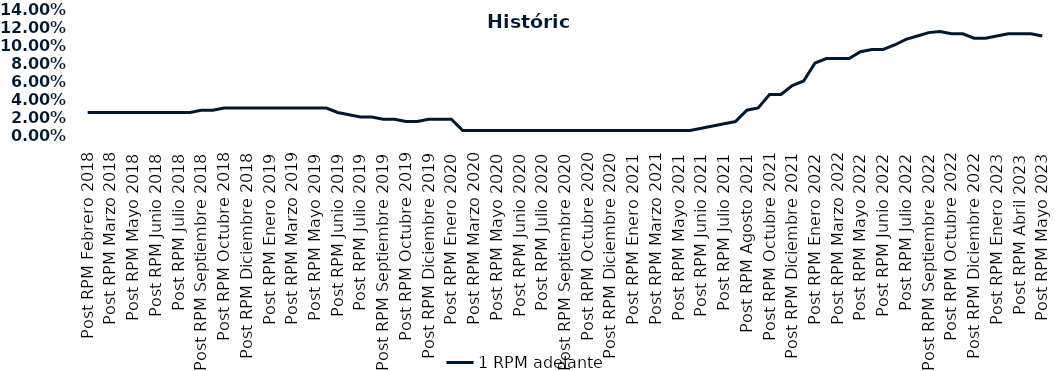
| Category | 1 RPM adelante |
|---|---|
| Post RPM Febrero 2018 | 0.025 |
| Pre RPM Marzo 2018 | 0.025 |
| Post RPM Marzo 2018 | 0.025 |
| Pre RPM Mayo 2018 | 0.025 |
| Post RPM Mayo 2018 | 0.025 |
| Pre RPM Junio 2018 | 0.025 |
| Post RPM Junio 2018 | 0.025 |
| Pre RPM Julio 2018 | 0.025 |
| Post RPM Julio 2018 | 0.025 |
| Pre RPM Septiembre 2018 | 0.025 |
| Post RPM Septiembre 2018 | 0.028 |
| Pre RPM Octubre 2018 | 0.028 |
| Post RPM Octubre 2018 | 0.03 |
| Pre RPM Diciembre 2018 | 0.03 |
| Post RPM Diciembre 2018 | 0.03 |
| Pre RPM Enero 2019 | 0.03 |
| Post RPM Enero 2019 | 0.03 |
| Pre RPM Marzo 2019 | 0.03 |
| Post RPM Marzo 2019 | 0.03 |
| Pre RPM Mayo 2019 | 0.03 |
| Post RPM Mayo 2019 | 0.03 |
| Pre RPM Junio 2019 | 0.03 |
| Post RPM Junio 2019 | 0.025 |
| Pre RPM Julio 2019 | 0.022 |
| Post RPM Julio 2019 | 0.02 |
| Pre RPM Septiembre 2019 | 0.02 |
| Post RPM Septiembre 2019 | 0.018 |
| Pre RPM Octubre 2019 | 0.018 |
| Post RPM Octubre 2019 | 0.015 |
| Pre RPM Diciembre 2019 | 0.015 |
| Post RPM Diciembre 2019 | 0.018 |
| Pre RPM Enero 2020 | 0.018 |
| Post RPM Enero 2020 | 0.018 |
| Pre RPM Marzo 2020 | 0.005 |
| Post RPM Marzo 2020 | 0.005 |
| Pre RPM Mayo 2020 | 0.005 |
| Post RPM Mayo 2020 | 0.005 |
| Pre RPM Junio 2020 | 0.005 |
| Post RPM Junio 2020 | 0.005 |
| Pre RPM Julio 2020 | 0.005 |
| Post RPM Julio 2020 | 0.005 |
| Pre RPM Septiembre 2020 | 0.005 |
| Post RPM Septiembre 2020 | 0.005 |
| Pre RPM Octubre 2020 | 0.005 |
| Post RPM Octubre 2020 | 0.005 |
| Pre RPM Diciembre 2020 | 0.005 |
| Post RPM Diciembre 2020 | 0.005 |
| Pre RPM Enero 2021 | 0.005 |
| Post RPM Enero 2021 | 0.005 |
| Pre RPM Marzo 2021 | 0.005 |
| Post RPM Marzo 2021 | 0.005 |
| Pre RPM Mayo 2021 | 0.005 |
| Post RPM Mayo 2021 | 0.005 |
| Pre RPM Junio 2021 | 0.005 |
| Post RPM Junio 2021 | 0.008 |
| Pre RPM Julio 2021 | 0.01 |
| Post RPM Julio 2021 | 0.012 |
| Pre RPM Agosto 2021 | 0.015 |
| Post RPM Agosto 2021 | 0.028 |
| Pre RPM Octubre 2021 | 0.03 |
| Post RPM Octubre 2021 | 0.045 |
| Pre RPM Diciembre 2021 | 0.045 |
| Post RPM Diciembre 2021 | 0.055 |
| Pre RPM Enero 2022 | 0.06 |
| Post RPM Enero 2022 | 0.08 |
| Pre RPM Marzo 2022 | 0.085 |
| Post RPM Marzo 2022 | 0.085 |
| Pre RPM Mayo 2022 | 0.085 |
| Post RPM Mayo 2022 | 0.092 |
| Pre RPM Junio 2022 | 0.095 |
| Post RPM Junio 2022 | 0.095 |
| Pre RPM Julio 2022 | 0.1 |
| Post RPM Julio 2022 | 0.106 |
| Pre RPM Septiembre 2022 | 0.11 |
| Post RPM Septiembre 2022 | 0.114 |
| Pre RPM Octubre 2022 | 0.115 |
| Post RPM Octubre 2022 | 0.112 |
| Pre RPM Diciembre 2022 | 0.112 |
| Post RPM Diciembre 2022 | 0.108 |
| Pre RPM Enero 2023 | 0.108 |
| Post RPM Enero 2023 | 0.11 |
| Pre RPM Abril 2023 | 0.112 |
| Post RPM Abril 2023 | 0.112 |
| Pre RPM Mayo 2023 | 0.112 |
| Post RPM Mayo 2023 | 0.11 |